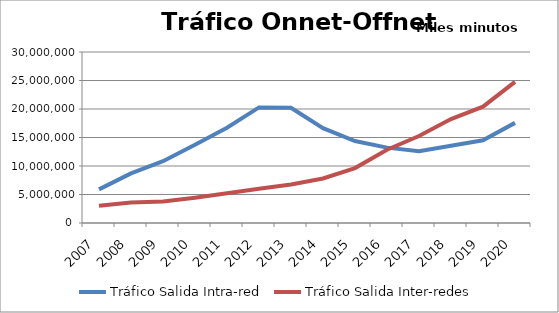
| Category | Tráfico Salida Intra-red | Tráfico Salida Inter-redes |
|---|---|---|
| 2007.0 | 5904083.795 | 3007133.407 |
| 2008.0 | 8700474.341 | 3605725.198 |
| 2009.0 | 10848127.978 | 3777186.553 |
| 2010.0 | 13731169.756 | 4442212.593 |
| 2011.0 | 16701623.385 | 5230021.942 |
| 2012.0 | 20281369.71 | 6022295.52 |
| 2013.0 | 20221752.311 | 6753941.544 |
| 2014.0 | 16638252.145 | 7814497.129 |
| 2015.0 | 14381121.54 | 9633316.484 |
| 2016.0 | 13225230.314 | 12856929.179 |
| 2017.0 | 12578132.761 | 15268259.097 |
| 2018.0 | 13561366.511 | 18231708.333 |
| 2019.0 | 14512688.723 | 20417632.119 |
| 2020.0 | 17565224.615 | 24757362.175 |